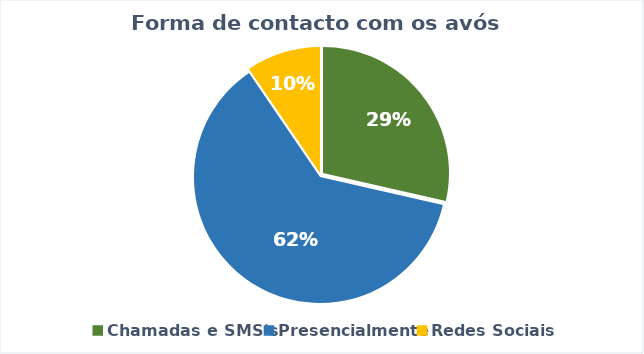
| Category | Series 0 |
|---|---|
| Chamadas e SMS's | 18 |
| Presencialmente | 39 |
| Redes Sociais | 6 |